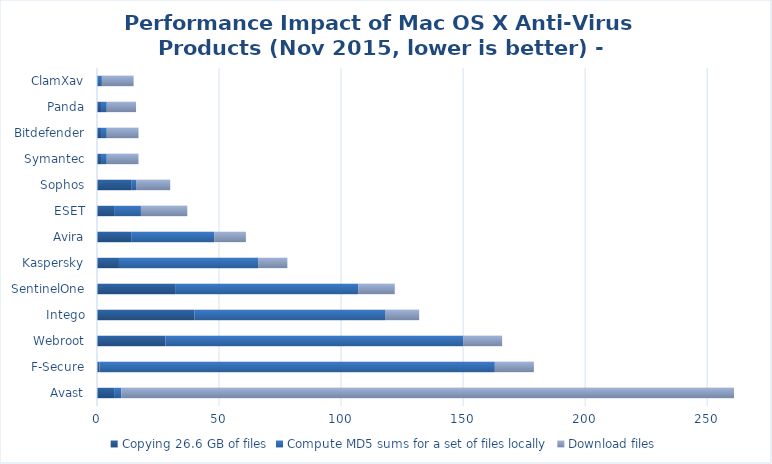
| Category | Copying 26.6 GB of files | Compute MD5 sums for a set of files locally | Download files |
|---|---|---|---|
| Avast | 7 | 3 | 251 |
| F-Secure | 1 | 162 | 16 |
| Webroot | 28 | 122 | 16 |
| Intego | 40 | 78 | 14 |
| SentinelOne | 32 | 75 | 15 |
| Kaspersky | 9 | 57 | 12 |
| Avira | 14 | 34 | 13 |
| ESET | 7 | 11 | 19 |
| Sophos | 14 | 2 | 14 |
| Symantec | 2 | 2 | 13 |
| Bitdefender | 2 | 2 | 13 |
| Panda | 2 | 2 | 12 |
| ClamXav | 0 | 2 | 13 |